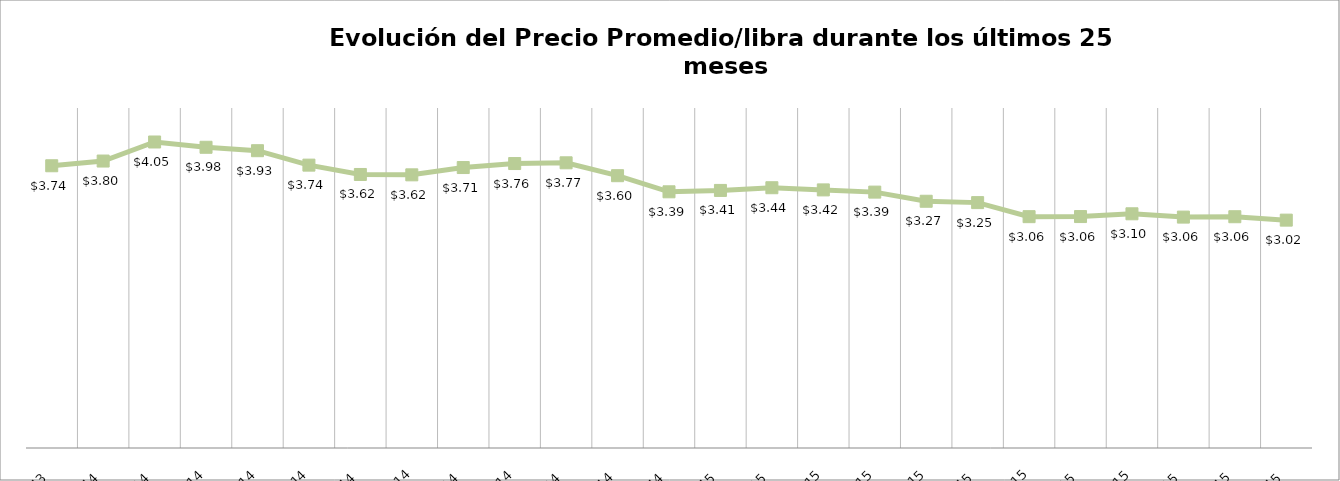
| Category | Series 1 |
|---|---|
| 2013-12-01 | 3.736 |
| 2014-01-01 | 3.798 |
| 2014-02-01 | 4.05 |
| 2014-03-01 | 3.98 |
| 2014-04-01 | 3.935 |
| 2014-05-01 | 3.744 |
| 2014-06-01 | 3.62 |
| 2014-07-01 | 3.615 |
| 2014-08-01 | 3.712 |
| 2014-09-01 | 3.765 |
| 2014-10-01 | 3.775 |
| 2014-11-01 | 3.604 |
| 2014-12-01 | 3.391 |
| 2015-01-01 | 3.409 |
| 2015-02-01 | 3.445 |
| 2015-03-01 | 3.416 |
| 2015-04-01 | 3.387 |
| 2015-05-01 | 3.266 |
| 2015-06-01 | 3.248 |
| 2015-07-01 | 3.062 |
| 2015-08-01 | 3.063 |
| 2015-09-01 | 3.1 |
| 2015-10-01 | 3.056 |
| 2015-11-01 | 3.061 |
| 2015-12-01 | 3.016 |